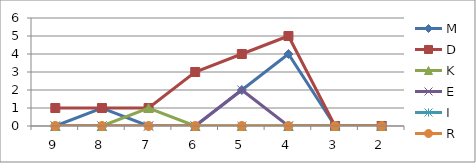
| Category | M | D | K | E | I | R |
|---|---|---|---|---|---|---|
| 9.0 | 0 | 1 | 0 | 0 | 0 | 0 |
| 8.0 | 1 | 1 | 0 | 0 | 0 | 0 |
| 7.0 | 0 | 1 | 1 | 0 | 0 | 0 |
| 6.0 | 0 | 3 | 0 | 0 | 0 | 0 |
| 5.0 | 2 | 4 | 0 | 2 | 0 | 0 |
| 4.0 | 4 | 5 | 0 | 0 | 0 | 0 |
| 3.0 | 0 | 0 | 0 | 0 | 0 | 0 |
| 2.0 | 0 | 0 | 0 | 0 | 0 | 0 |